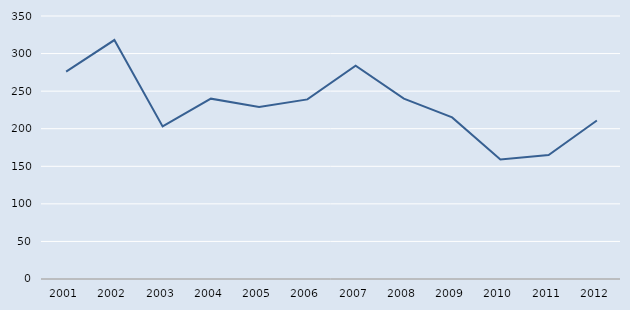
| Category | Series 0 |
|---|---|
| 2001.0 | 276 |
| 2002.0 | 318 |
| 2003.0 | 203 |
| 2004.0 | 240 |
| 2005.0 | 229 |
| 2006.0 | 239 |
| 2007.0 | 284 |
| 2008.0 | 240 |
| 2009.0 | 215 |
| 2010.0 | 159 |
| 2011.0 | 165 |
| 2012.0 | 211 |